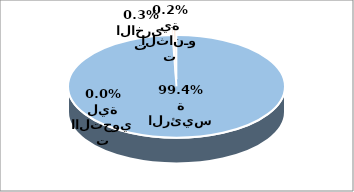
| Category | Series 0 |
|---|---|
| الايرادات الرئيسة | 430956058 |
| الايـرادات الثانـوية | 994995 |
| الايرادات االتحويلية | 150 |
| الايرادات الاخرى | 1476659 |